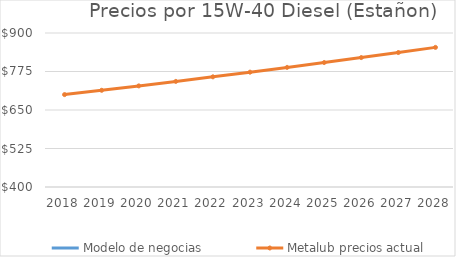
| Category | Modelo de negocias  | Metalub precios actual |
|---|---|---|
| 2018 | 0 | 700 |
| 2019 | 0 | 714 |
| 2020 | 0 | 728.28 |
| 2021 | 0 | 742.846 |
| 2022 | 0 | 757.703 |
| 2023 | 0 | 772.857 |
| 2024 | 0 | 788.314 |
| 2025 | 0 | 804.08 |
| 2026 | 0 | 820.162 |
| 2027 | 0 | 836.565 |
| 2028 | 0 | 853.296 |